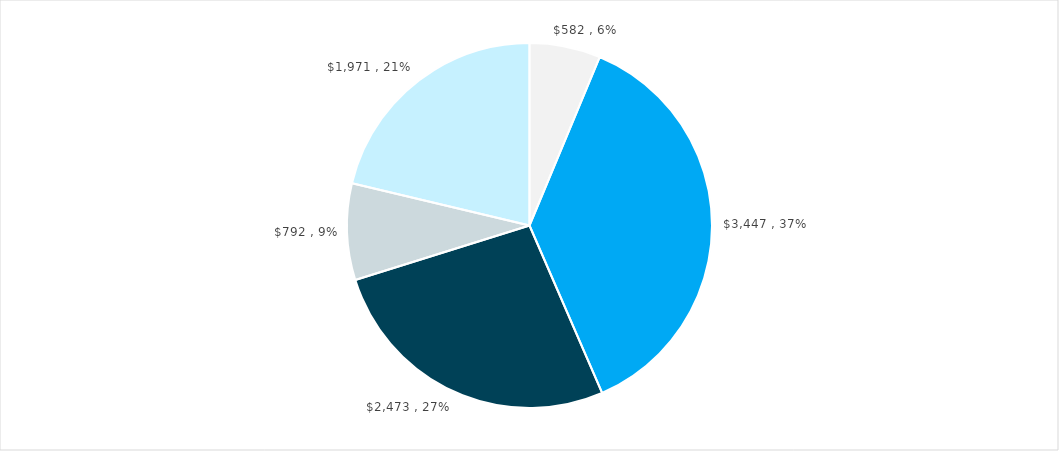
| Category | Series 1 |
|---|---|
| 0 | 0.063 |
| 1 | 0.372 |
| 2 | 0.267 |
| 3 | 0.085 |
| 4 | 0.213 |